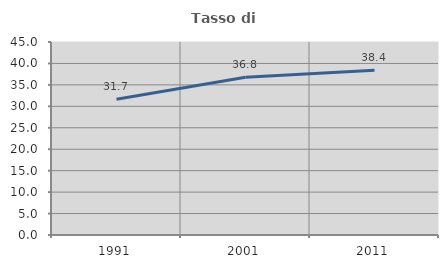
| Category | Tasso di occupazione   |
|---|---|
| 1991.0 | 31.662 |
| 2001.0 | 36.802 |
| 2011.0 | 38.405 |